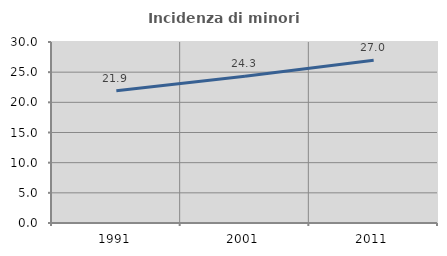
| Category | Incidenza di minori stranieri |
|---|---|
| 1991.0 | 21.905 |
| 2001.0 | 24.307 |
| 2011.0 | 26.967 |